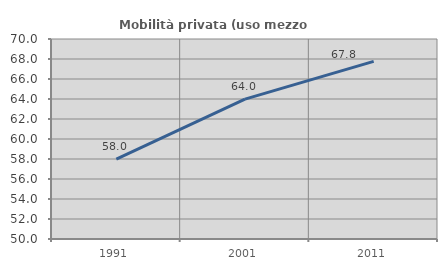
| Category | Mobilità privata (uso mezzo privato) |
|---|---|
| 1991.0 | 57.989 |
| 2001.0 | 63.983 |
| 2011.0 | 67.761 |